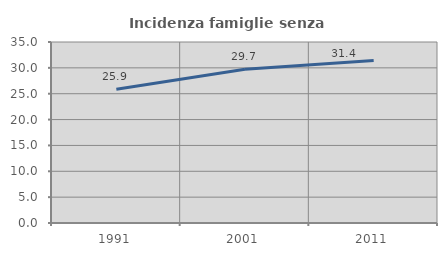
| Category | Incidenza famiglie senza nuclei |
|---|---|
| 1991.0 | 25.877 |
| 2001.0 | 29.74 |
| 2011.0 | 31.439 |